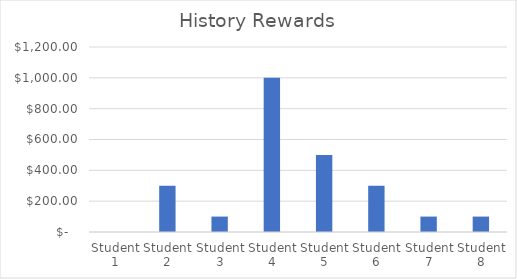
| Category | History Rewards |
|---|---|
| Student 1 | 0 |
| Student 2 | 300 |
| Student 3 | 100 |
| Student 4 | 1000 |
| Student 5 | 500 |
| Student 6 | 300 |
| Student 7 | 100 |
| Student 8 | 100 |